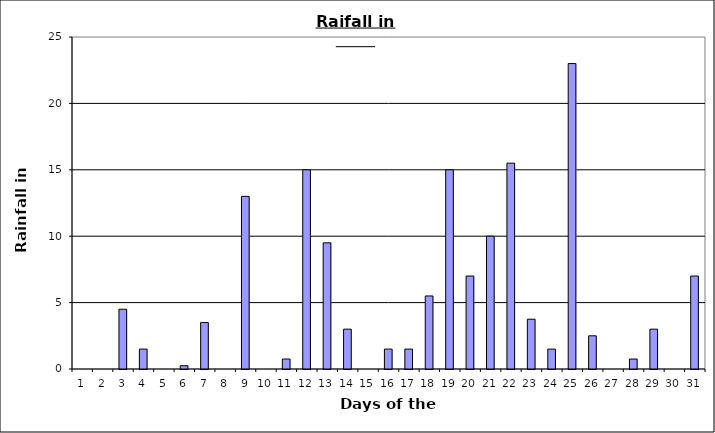
| Category | Series 0 |
|---|---|
| 0 | 0 |
| 1 | 0 |
| 2 | 4.5 |
| 3 | 1.5 |
| 4 | 0 |
| 5 | 0.25 |
| 6 | 3.5 |
| 7 | 0 |
| 8 | 13 |
| 9 | 0 |
| 10 | 0.75 |
| 11 | 15 |
| 12 | 9.5 |
| 13 | 3 |
| 14 | 0 |
| 15 | 1.5 |
| 16 | 1.5 |
| 17 | 5.5 |
| 18 | 15 |
| 19 | 7 |
| 20 | 10 |
| 21 | 15.5 |
| 22 | 3.75 |
| 23 | 1.5 |
| 24 | 23 |
| 25 | 2.5 |
| 26 | 0 |
| 27 | 0.75 |
| 28 | 3 |
| 29 | 0 |
| 30 | 7 |